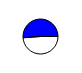
| Category | Series 0 |
|---|---|
| 0 | 7554114 |
| 1 | 7905763 |